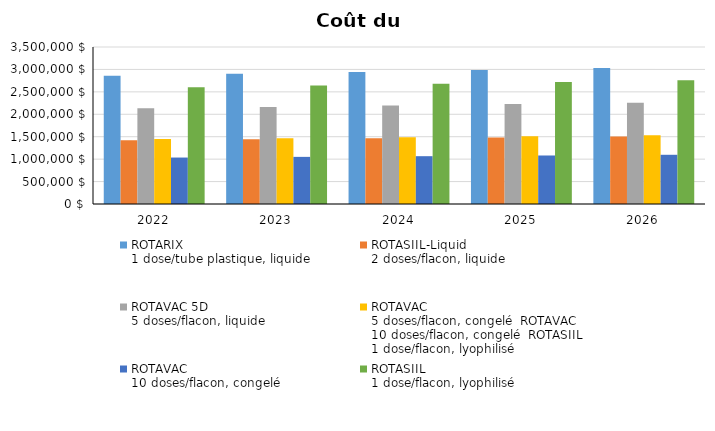
| Category | ROTARIX
1 dose/tube plastique, liquide | ROTASIIL-Liquid
2 doses/flacon, liquide | ROTAVAC 5D
5 doses/flacon, liquide | ROTAVAC
5 doses/flacon, congelé ROTAVAC
10 doses/flacon, congelé ROTASIIL
1 dose/flacon, lyophilisé | ROTAVAC
10 doses/flacon, congelé | ROTASIIL
1 dose/flacon, lyophilisé |
|---|---|---|---|---|---|---|
| 2022.0 | 2859908.333 | 1421921.538 | 2132218.621 | 1446975.789 | 1035545.106 | 2601897.5 |
| 2023.0 | 2901481.975 | 1442591.592 | 2163214.053 | 1468010.049 | 1050598.52 | 2639720.515 |
| 2024.0 | 2943659.961 | 1463562.119 | 2194660.056 | 1489350.077 | 1065870.76 | 2678093.352 |
| 2025.0 | 2986451.076 | 1484837.489 | 2226563.18 | 1511000.319 | 1081365.008 | 2717024.003 |
| 2026.0 | 3029864.233 | 1506422.133 | 2258930.071 | 1532965.284 | 1097084.491 | 2756520.578 |